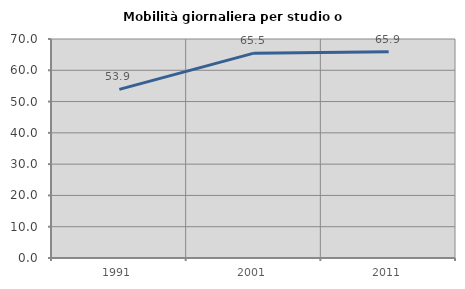
| Category | Mobilità giornaliera per studio o lavoro |
|---|---|
| 1991.0 | 53.886 |
| 2001.0 | 65.481 |
| 2011.0 | 65.947 |